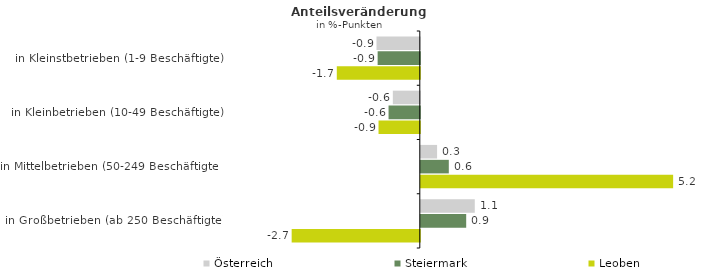
| Category | Österreich | Steiermark | Leoben |
|---|---|---|---|
| in Kleinstbetrieben (1-9 Beschäftigte) | -0.898 | -0.875 | -1.722 |
| in Kleinbetrieben (10-49 Beschäftigte) | -0.559 | -0.648 | -0.856 |
| in Mittelbetrieben (50-249 Beschäftigte) | 0.338 | 0.581 | 5.235 |
| in Großbetrieben (ab 250 Beschäftigte) | 1.12 | 0.942 | -2.658 |